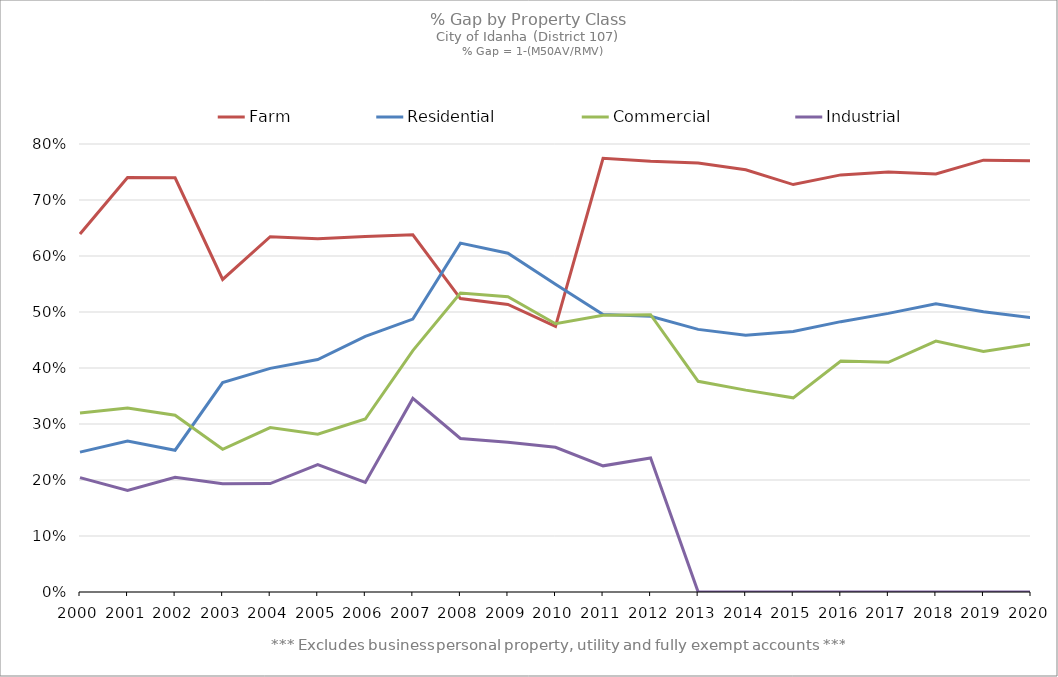
| Category | Farm | Residential | Commercial | Industrial |
|---|---|---|---|---|
| 2000.0 | 0.639 | 0.25 | 0.32 | 0.204 |
| 2001.0 | 0.74 | 0.27 | 0.329 | 0.182 |
| 2002.0 | 0.74 | 0.253 | 0.316 | 0.205 |
| 2003.0 | 0.558 | 0.374 | 0.255 | 0.193 |
| 2004.0 | 0.634 | 0.399 | 0.294 | 0.194 |
| 2005.0 | 0.631 | 0.415 | 0.282 | 0.227 |
| 2006.0 | 0.635 | 0.456 | 0.309 | 0.196 |
| 2007.0 | 0.638 | 0.487 | 0.431 | 0.346 |
| 2008.0 | 0.524 | 0.623 | 0.534 | 0.274 |
| 2009.0 | 0.514 | 0.605 | 0.527 | 0.267 |
| 2010.0 | 0.474 | 0.55 | 0.479 | 0.259 |
| 2011.0 | 0.774 | 0.495 | 0.494 | 0.225 |
| 2012.0 | 0.769 | 0.492 | 0.495 | 0.239 |
| 2013.0 | 0.766 | 0.469 | 0.376 | 0 |
| 2014.0 | 0.754 | 0.459 | 0.361 | 0 |
| 2015.0 | 0.728 | 0.465 | 0.347 | 0 |
| 2016.0 | 0.745 | 0.483 | 0.412 | 0 |
| 2017.0 | 0.75 | 0.498 | 0.41 | 0 |
| 2018.0 | 0.747 | 0.515 | 0.448 | 0 |
| 2019.0 | 0.771 | 0.501 | 0.429 | 0 |
| 2020.0 | 0.77 | 0.49 | 0.443 | 0 |